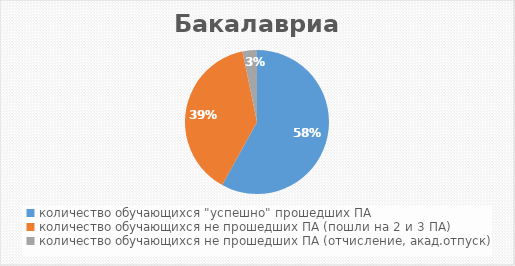
| Category | Бакалавриат |
|---|---|
| количество обучающихся "успешно" прошедших ПА | 448 |
| количество обучающихся не прошедших ПА (пошли на 2 и 3 ПА) | 299 |
| количество обучающихся не прошедших ПА (отчисление, акад.отпуск) | 25 |